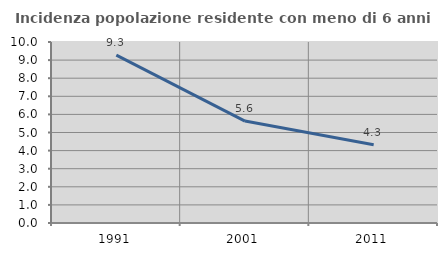
| Category | Incidenza popolazione residente con meno di 6 anni |
|---|---|
| 1991.0 | 9.272 |
| 2001.0 | 5.631 |
| 2011.0 | 4.324 |